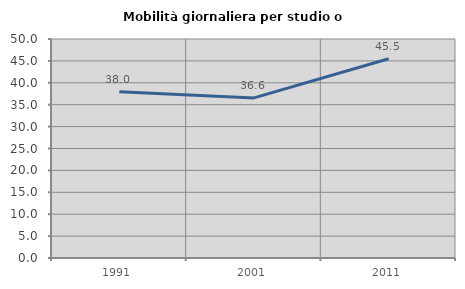
| Category | Mobilità giornaliera per studio o lavoro |
|---|---|
| 1991.0 | 37.98 |
| 2001.0 | 36.55 |
| 2011.0 | 45.498 |